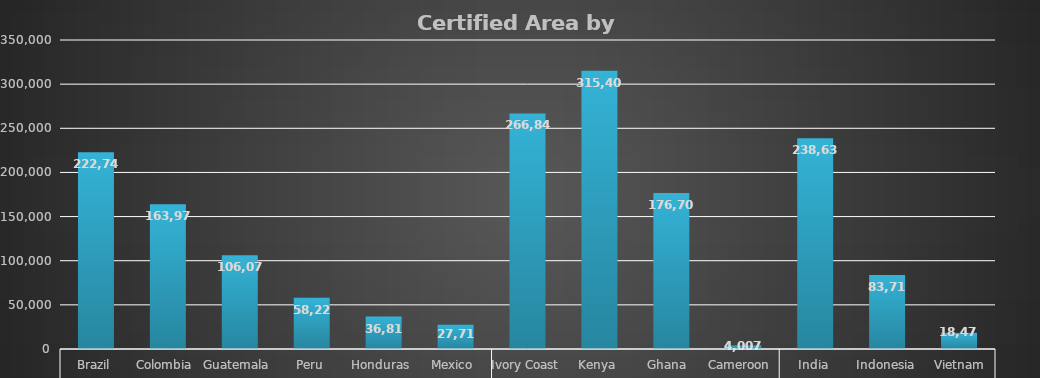
| Category | Dec-21 |
|---|---|
| 0 | 222739.62 |
| 1 | 163974.4 |
| 2 | 106078.5 |
| 3 | 58224.32 |
| 4 | 36810.35 |
| 5 | 27718.96 |
| 6 | 266843.29 |
| 7 | 315407.73 |
| 8 | 176708.31 |
| 9 | 4007.12 |
| 10 | 238631.09 |
| 11 | 83713.48 |
| 12 | 18477.96 |